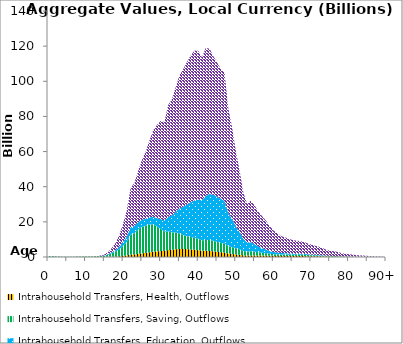
| Category | Intrahousehold Transfers, Health, Outflows | Intrahousehold Transfers, Saving, Outflows | Intrahousehold Transfers, Education, Outflows | Intrahousehold Transfers, Consumption other than health and education, Outflows |
|---|---|---|---|---|
| 0 | 7.208 | 338.905 | 8.77 | 118.164 |
|  | 6.194 | 398.302 | 8.915 | 109.804 |
| 2 | 5.161 | 332.792 | 6.465 | 77.292 |
| 3 | 4.558 | 256.417 | 4.084 | 53.837 |
| 4 | 3.62 | 188.799 | 2.161 | 35.08 |
| 5 | 2.785 | 152.828 | 0.852 | 19.651 |
| 6 | 1.656 | 147.451 | 0.221 | 10.907 |
| 7 | 0.926 | 182.013 | 0.143 | 7.164 |
| 8 | 1.159 | 234.242 | 0.177 | 7.626 |
| 9 | 2.183 | 244.788 | 0.145 | 8.677 |
| 10 | 3.691 | 308.56 | 0.119 | 10.965 |
| 11 | 4.185 | 322.572 | 0.178 | 12.42 |
| 12 | 10.511 | 329.734 | 0.302 | 29.116 |
| 13 | 17.978 | 407.673 | 6.797 | 72.334 |
| 14 | 29.791 | 533.685 | 47.9 | 226.171 |
| 15 | 52.289 | 703.26 | 138.855 | 567.022 |
| 16 | 83.526 | 1179.343 | 308.316 | 1258.867 |
| 17 | 130.2 | 1968.75 | 577.931 | 2448.831 |
| 18 | 208.321 | 2799.493 | 925.268 | 4102.198 |
| 19 | 365.431 | 4051.506 | 1561.005 | 6722.205 |
| 20 | 597.65 | 5773.344 | 2323.612 | 10259.06 |
| 21 | 904.93 | 7752.771 | 3143.556 | 14889.729 |
| 22 | 1370.186 | 11265.874 | 4289.608 | 22381.866 |
| 23 | 1486.957 | 11997.48 | 4147.14 | 24477.663 |
| 24 | 1773.609 | 13795.155 | 4198.509 | 29197.222 |
| 25 | 2063.751 | 15019.837 | 4125.174 | 33969.477 |
| 26 | 2318.142 | 15426.61 | 3987.933 | 38214.921 |
| 27 | 2653.917 | 15797.032 | 4040.078 | 43777.227 |
| 28 | 2987.095 | 15628.327 | 4289.423 | 49149.676 |
| 29 | 3193.155 | 14082.573 | 4850.289 | 52946.411 |
| 30 | 3341.527 | 12624.475 | 5606.434 | 55850.638 |
| 31 | 3400.027 | 10981.703 | 6312.92 | 56211.069 |
| 32 | 3923.363 | 10645.074 | 8239.937 | 63706.673 |
| 33 | 4096.312 | 9887.899 | 9733.759 | 66049.468 |
| 34 | 4413.918 | 9544.92 | 11807.067 | 70859.08 |
| 35 | 4618.57 | 8783.509 | 14221.779 | 75708.811 |
| 36 | 4541.258 | 7920.665 | 16185.083 | 78231.43 |
| 37 | 4467.683 | 7344.047 | 18047.441 | 81116.06 |
| 38 | 4292.757 | 7041.311 | 19859.559 | 83498.063 |
| 39 | 4096.201 | 6803.051 | 21411.441 | 85162.899 |
| 40 | 3868.908 | 6505.573 | 22293.024 | 84687.64 |
| 41 | 3540.643 | 6002.009 | 22788.237 | 81313.86 |
| 42 | 3557.834 | 6078.471 | 25246.273 | 84047.521 |
| 43 | 3438.959 | 6202.72 | 26236.368 | 82729.378 |
| 44 | 3182.412 | 6033.984 | 26205.171 | 78981.04 |
| 45 | 2936.39 | 5681.833 | 25871.667 | 76249.443 |
| 46 | 2694.625 | 5268.986 | 25229.915 | 73976.617 |
| 47 | 2520.545 | 5052.259 | 24362.685 | 73016.024 |
| 48 | 1993.614 | 4145.584 | 19103.881 | 59446.033 |
| 49 | 1747.929 | 3922.55 | 16083.639 | 52158.056 |
| 50 | 1453.198 | 3556.718 | 12596.608 | 42827.179 |
| 51 | 1217.886 | 3169.029 | 9786.299 | 35173.404 |
| 52 | 945.789 | 2525.338 | 6873.906 | 26435.841 |
| 53 | 812.465 | 2184.775 | 5281.365 | 21929.814 |
| 54 | 904.534 | 2378.242 | 5152.99 | 23587.559 |
| 55 | 880.523 | 2158.243 | 4291.611 | 22102.232 |
| 56 | 818.697 | 1868.002 | 3340.68 | 19748.342 |
| 57 | 790.115 | 1636.994 | 2626.833 | 18213.681 |
| 58 | 760.301 | 1418.616 | 2047.947 | 16558.277 |
| 59 | 702.822 | 1181.753 | 1531.878 | 14356.693 |
| 60 | 639.76 | 1011.818 | 1164.938 | 12316.153 |
| 61 | 608.576 | 976.244 | 965.498 | 11119.794 |
| 62 | 554.818 | 918.82 | 804.373 | 9695.302 |
| 63 | 543.592 | 882.744 | 746.273 | 9092.725 |
| 64 | 532.841 | 801.087 | 697.644 | 8442.73 |
| 65 | 524.243 | 728.017 | 649.357 | 7811.921 |
| 66 | 525.341 | 705.571 | 616.385 | 7478.755 |
| 67 | 529.197 | 707.946 | 584.518 | 7296.855 |
| 68 | 512.267 | 693.717 | 533.963 | 6937.243 |
| 69 | 471.053 | 641.961 | 457.659 | 6282.879 |
| 70 | 438.248 | 592.837 | 385.234 | 5740.396 |
| 71 | 410.275 | 525.176 | 335.727 | 5169.05 |
| 72 | 389.117 | 445.265 | 300.518 | 4768.491 |
| 73 | 353.475 | 357.817 | 246.892 | 4174.871 |
| 74 | 302.315 | 298.051 | 187.039 | 3482.276 |
| 75 | 259.682 | 255.3 | 145.077 | 2960.239 |
| 76 | 242.821 | 230.979 | 117.183 | 2713.514 |
| 77 | 219.494 | 194.664 | 95.798 | 2426.051 |
| 78 | 178.647 | 141.958 | 72.402 | 1940.424 |
| 79 | 151.087 | 105.287 | 59.148 | 1596.782 |
| 80 | 130.776 | 81.586 | 52.576 | 1357.079 |
| 81 | 111.632 | 71.741 | 48.271 | 1174.169 |
| 82 | 84.802 | 56.165 | 39.306 | 913.405 |
| 83 | 70.101 | 47.662 | 35.066 | 775.895 |
| 84 | 57.904 | 42.975 | 32.538 | 668.599 |
| 85 | 44.522 | 35.499 | 27.892 | 537.402 |
| 86 | 36.122 | 31.505 | 25.647 | 459.987 |
| 87 | 21.691 | 21.175 | 17.791 | 295.232 |
| 88 | 14.644 | 0 | 14.211 | 217.069 |
| 89 | 9.383 | 0 | 11.137 | 155.79 |
| 90+ | 19.507 | 0 | 30.62 | 388.266 |